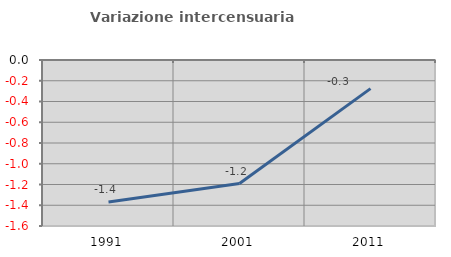
| Category | Variazione intercensuaria annua |
|---|---|
| 1991.0 | -1.369 |
| 2001.0 | -1.191 |
| 2011.0 | -0.276 |